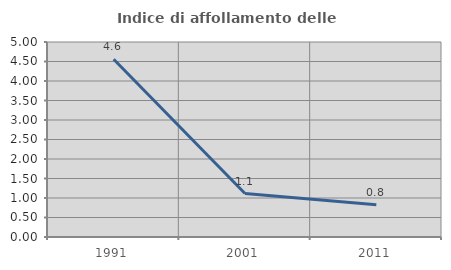
| Category | Indice di affollamento delle abitazioni  |
|---|---|
| 1991.0 | 4.556 |
| 2001.0 | 1.114 |
| 2011.0 | 0.827 |